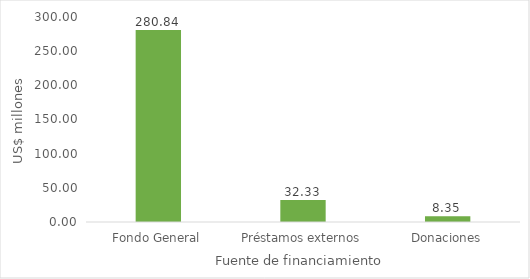
| Category | Series 0 |
|---|---|
| Fondo General | 280.843 |
| Préstamos externos | 32.333 |
| Donaciones | 8.354 |